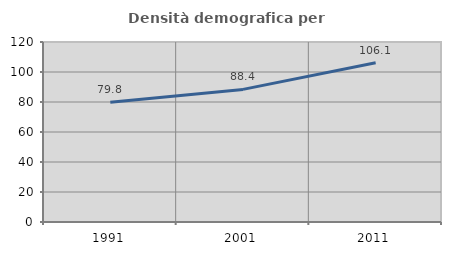
| Category | Densità demografica |
|---|---|
| 1991.0 | 79.756 |
| 2001.0 | 88.402 |
| 2011.0 | 106.112 |